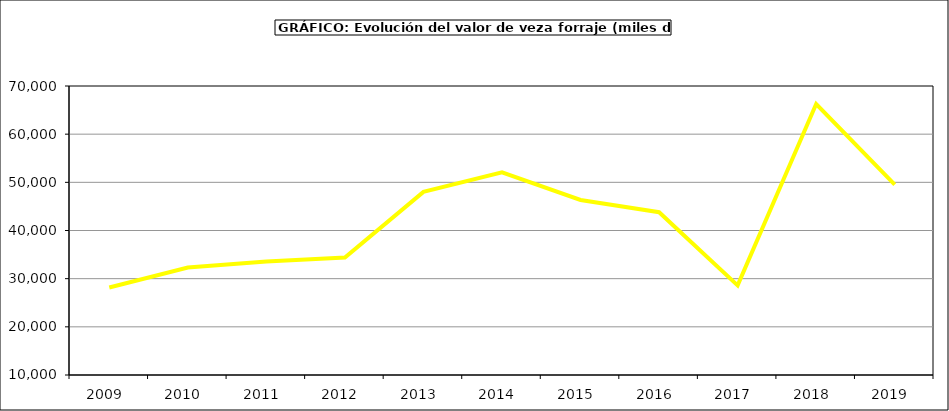
| Category | Valor |
|---|---|
| 2009.0 | 28162.401 |
| 2010.0 | 32296.558 |
| 2011.0 | 33540.553 |
| 2012.0 | 34393.555 |
| 2013.0 | 48025.512 |
| 2014.0 | 52077.137 |
| 2015.0 | 46338 |
| 2016.0 | 43806 |
| 2017.0 | 28604.284 |
| 2018.0 | 66265.658 |
| 2019.0 | 49524.023 |